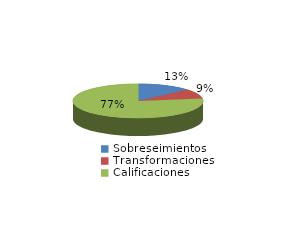
| Category | Series 0 |
|---|---|
| Sobreseimientos | 308 |
| Transformaciones | 213 |
| Calificaciones | 1779 |